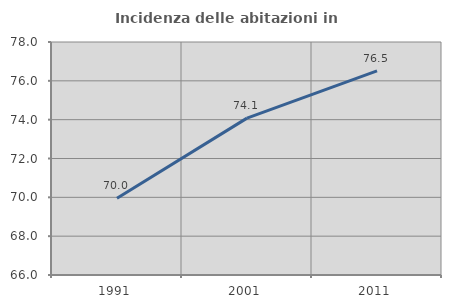
| Category | Incidenza delle abitazioni in proprietà  |
|---|---|
| 1991.0 | 69.955 |
| 2001.0 | 74.081 |
| 2011.0 | 76.509 |